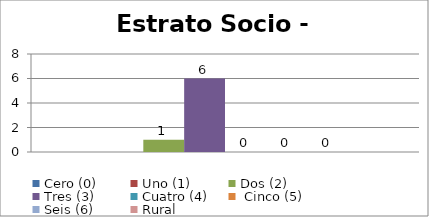
| Category | Cero (0) | Uno (1)   | Dos (2) | Tres (3) | Cuatro (4) |  Cinco (5) | Seis (6) | Rural |
|---|---|---|---|---|---|---|---|---|
| 0 |  |  | 1 | 6 | 0 | 0 | 0 |  |